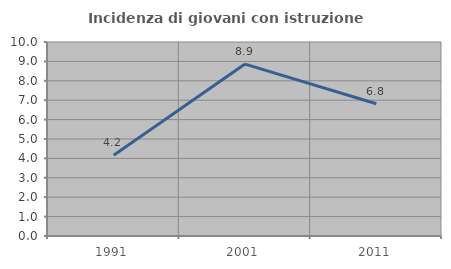
| Category | Incidenza di giovani con istruzione universitaria |
|---|---|
| 1991.0 | 4.167 |
| 2001.0 | 8.861 |
| 2011.0 | 6.818 |